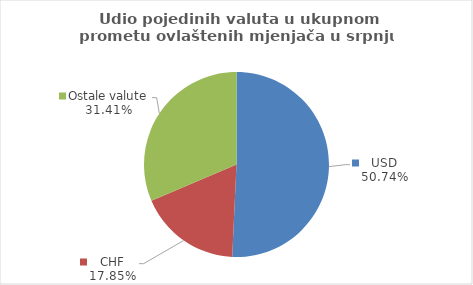
| Category | Series 0 |
|---|---|
| USD | 50.739 |
| CHF | 17.851 |
| Ostale valute | 31.41 |